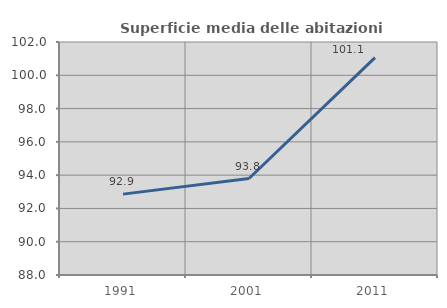
| Category | Superficie media delle abitazioni occupate |
|---|---|
| 1991.0 | 92.859 |
| 2001.0 | 93.797 |
| 2011.0 | 101.064 |